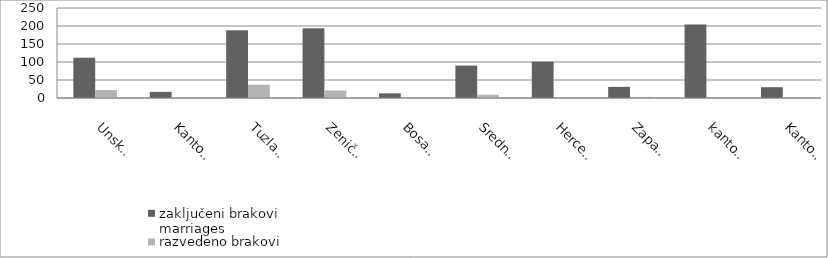
| Category | zaključeni brakovi
marriages | razvedeno brakovi
divorces |
|---|---|---|
| Unsko - sanski | 112 | 22 |
| Kanton Posavski | 17 | 0 |
| Tuzlanski | 188 | 37 |
| Zeničko - dobojski | 194 | 21 |
| Bosansko - podrinjski | 13 | 1 |
| Srednjobosanski | 90 | 9 |
| Hercegovačko-neretvanski | 101 | 0 |
| Zapadnohercegovački | 31 | 3 |
| kanton Sarajevo | 204 | 2 |
| Kanton 10 | 30 | 1 |